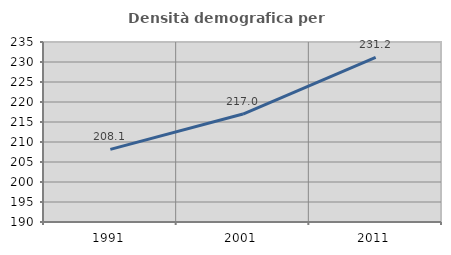
| Category | Densità demografica |
|---|---|
| 1991.0 | 208.149 |
| 2001.0 | 216.997 |
| 2011.0 | 231.18 |